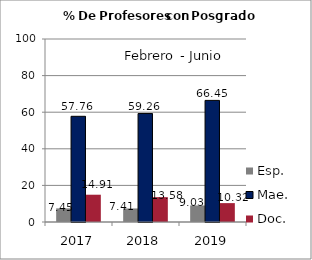
| Category | Esp. | Mae. | Doc. |
|---|---|---|---|
| 2017.0 | 7.45 | 57.76 | 14.91 |
| 2018.0 | 7.41 | 59.26 | 13.58 |
| 2019.0 | 9.03 | 66.45 | 10.32 |